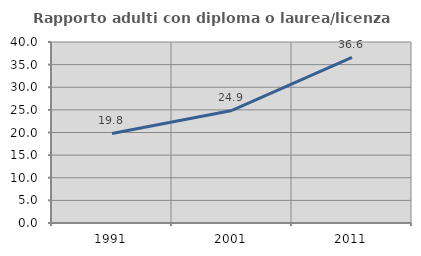
| Category | Rapporto adulti con diploma o laurea/licenza media  |
|---|---|
| 1991.0 | 19.794 |
| 2001.0 | 24.872 |
| 2011.0 | 36.595 |